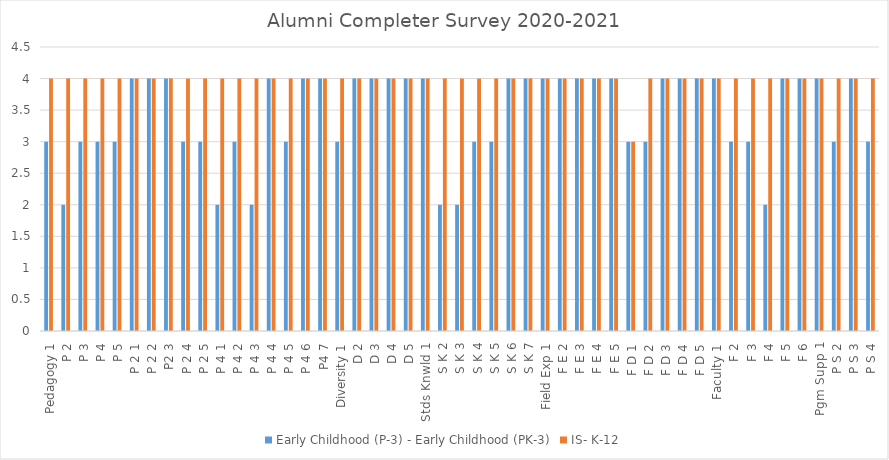
| Category | Early Childhood (P-3) - Early Childhood (PK-3) | IS- K-12 |
|---|---|---|
| Pedagogy 1 | 3 | 4 |
| P 2 | 2 | 4 |
| P 3 | 3 | 4 |
| P 4 | 3 | 4 |
| P 5 | 3 | 4 |
| P 2 1 | 4 | 4 |
| P 2 2 | 4 | 4 |
| P2 3 | 4 | 4 |
| P 2 4 | 3 | 4 |
| P 2 5 | 3 | 4 |
| P 4 1 | 2 | 4 |
| P 4 2 | 3 | 4 |
| P 4 3 | 2 | 4 |
| P 4 4 | 4 | 4 |
| P 4 5 | 3 | 4 |
| P 4 6 | 4 | 4 |
| P4 7 | 4 | 4 |
| Diversity 1 | 3 | 4 |
| D 2 | 4 | 4 |
| D 3 | 4 | 4 |
| D 4 | 4 | 4 |
| D 5 | 4 | 4 |
| Stds Knwld 1 | 4 | 4 |
| S K 2 | 2 | 4 |
| S K 3 | 2 | 4 |
| S K 4 | 3 | 4 |
| S K 5 | 3 | 4 |
| S K 6 | 4 | 4 |
| S K 7 | 4 | 4 |
| Field Exp 1 | 4 | 4 |
| F E 2 | 4 | 4 |
| F E 3 | 4 | 4 |
| F E 4 | 4 | 4 |
| F E 5 | 4 | 4 |
| F D 1 | 3 | 3 |
| F D 2 | 3 | 4 |
| F D 3 | 4 | 4 |
| F D 4 | 4 | 4 |
| F D 5 | 4 | 4 |
| Faculty 1 | 4 | 4 |
| F 2 | 3 | 4 |
| F 3 | 3 | 4 |
| F 4 | 2 | 4 |
| F 5 | 4 | 4 |
| F 6 | 4 | 4 |
| Pgm Supp 1 | 4 | 4 |
| P S 2 | 3 | 4 |
| P S 3 | 4 | 4 |
| P S 4 | 3 | 4 |